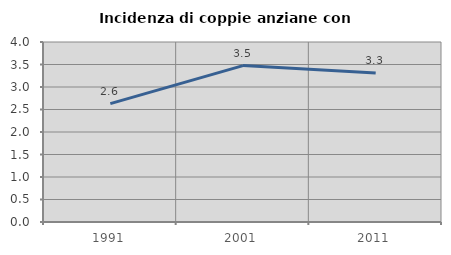
| Category | Incidenza di coppie anziane con figli |
|---|---|
| 1991.0 | 2.632 |
| 2001.0 | 3.476 |
| 2011.0 | 3.311 |